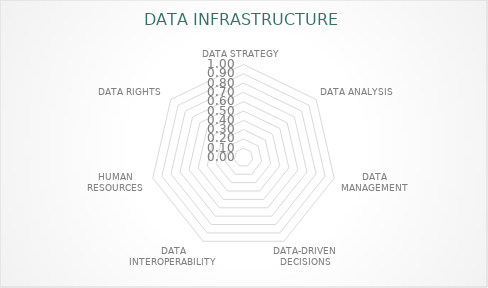
| Category | Series 0 |
|---|---|
| DATA STRATEGY | 0 |
| DATA ANALYSIS | 0 |
| DATA MANAGEMENT | 0 |
| DATA-DRIVEN DECISIONS | 0 |
| DATA INTEROPERABILITY | 0 |
| HUMAN RESOURCES | 0 |
| DATA RIGHTS | 0 |